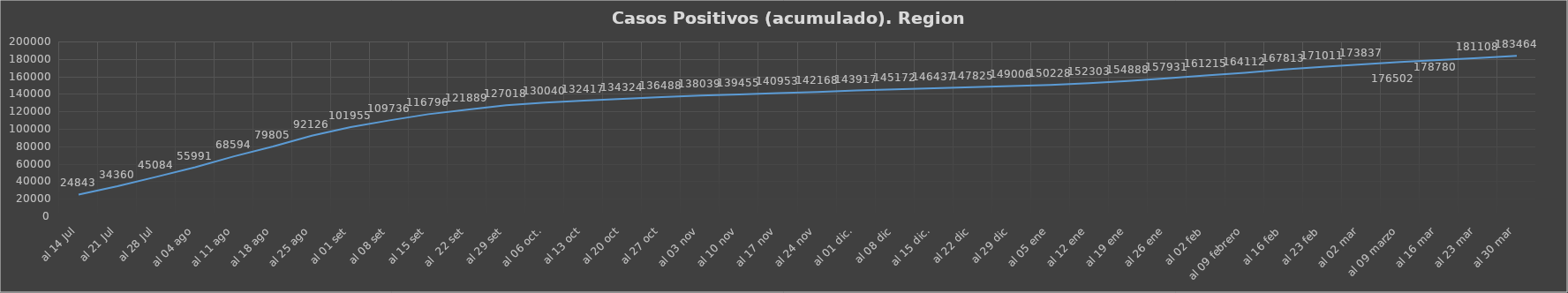
| Category | Series 0 |
|---|---|
| al 14 Jul | 24843 |
| al 21 Jul | 34360 |
| al 28 Jul | 45084 |
| al 04 ago | 55991 |
| al 11 ago | 68594 |
| al 18 ago | 79805 |
| al 25 ago | 92126 |
| al 01 set | 101955 |
| al 08 set | 109736 |
| al 15 set | 116796 |
| al  22 set | 121889 |
| al 29 set | 127018 |
| al 06 oct. | 130040 |
| al 13 oct | 132417 |
| al 20 oct | 134324 |
| al 27 oct | 136488 |
| al 03 nov | 138039 |
| al 10 nov | 139455 |
| al 17 nov | 140953 |
| al 24 nov | 142168 |
| al 01 dic. | 143917 |
| al 08 dic | 145172 |
| al 15 dic. | 146437 |
| al 22 dic | 147825 |
| al 29 dic | 149006 |
| al 05 ene | 150228 |
| al 12 ene | 152303 |
| al 19 ene | 154888 |
| al 26 ene | 157931 |
| al 02 feb | 161215 |
| al 09 febrero | 164112 |
| al 16 feb | 167813 |
| al 23 feb | 171011 |
| al 02 mar | 173837 |
| al 09 marzo | 176502 |
| al 16 mar | 178780 |
| al 23 mar | 181108 |
| al 30 mar | 183464 |